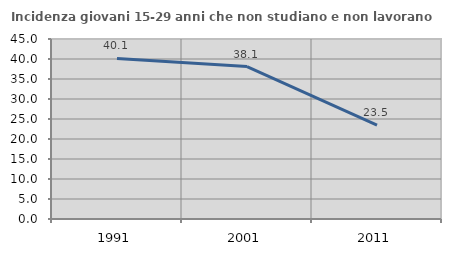
| Category | Incidenza giovani 15-29 anni che non studiano e non lavorano  |
|---|---|
| 1991.0 | 40.138 |
| 2001.0 | 38.095 |
| 2011.0 | 23.495 |